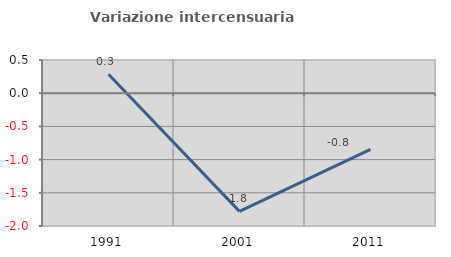
| Category | Variazione intercensuaria annua |
|---|---|
| 1991.0 | 0.286 |
| 2001.0 | -1.78 |
| 2011.0 | -0.846 |